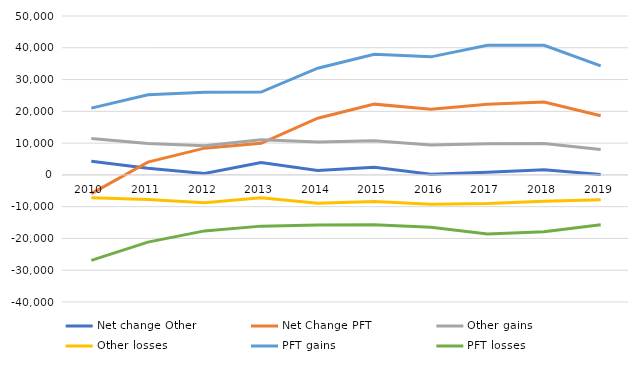
| Category | Net change Other  | Net Change PFT  | Other gains | Other losses | PFT gains | PFT losses |
|---|---|---|---|---|---|---|
| 2010.0 | 4277 | -5893 | 11466 | -7189 | 20999 | -26892 |
| 2011.0 | 2099 | 4029 | 9871 | -7772 | 25195 | -21166 |
| 2012.0 | 415 | 8419 | 9151 | -8736 | 26043 | -17624 |
| 2013.0 | 3899 | 9941 | 11089 | -7190 | 26065 | -16124 |
| 2014.0 | 1369 | 17833 | 10317 | -8948 | 33565 | -15732 |
| 2015.0 | 2378 | 22264 | 10724 | -8346 | 37980 | -15716 |
| 2016.0 | 177 | 20693 | 9385 | -9208 | 37145 | -16452 |
| 2017.0 | 824 | 22200 | 9823 | -8999 | 40813 | -18613 |
| 2018.0 | 1617 | 22928 | 9905 | -8288 | 40800 | -17872 |
| 2019.0 | 128 | 18633 | 7954 | -7826 | 34324 | -15691 |